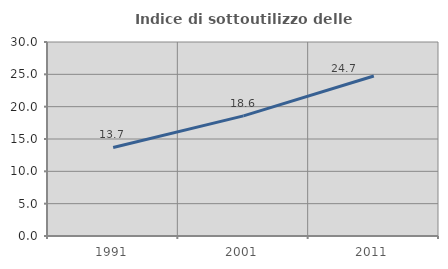
| Category | Indice di sottoutilizzo delle abitazioni  |
|---|---|
| 1991.0 | 13.698 |
| 2001.0 | 18.57 |
| 2011.0 | 24.745 |